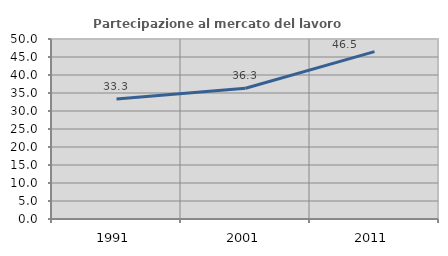
| Category | Partecipazione al mercato del lavoro  femminile |
|---|---|
| 1991.0 | 33.333 |
| 2001.0 | 36.331 |
| 2011.0 | 46.479 |